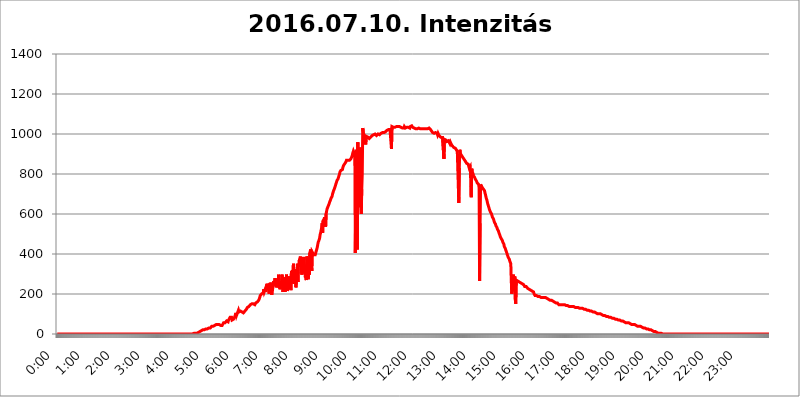
| Category | 2016.07.10. Intenzitás [W/m^2] |
|---|---|
| 0.0 | 0 |
| 0.0006944444444444445 | 0 |
| 0.001388888888888889 | 0 |
| 0.0020833333333333333 | 0 |
| 0.002777777777777778 | 0 |
| 0.003472222222222222 | 0 |
| 0.004166666666666667 | 0 |
| 0.004861111111111111 | 0 |
| 0.005555555555555556 | 0 |
| 0.0062499999999999995 | 0 |
| 0.006944444444444444 | 0 |
| 0.007638888888888889 | 0 |
| 0.008333333333333333 | 0 |
| 0.009027777777777779 | 0 |
| 0.009722222222222222 | 0 |
| 0.010416666666666666 | 0 |
| 0.011111111111111112 | 0 |
| 0.011805555555555555 | 0 |
| 0.012499999999999999 | 0 |
| 0.013194444444444444 | 0 |
| 0.013888888888888888 | 0 |
| 0.014583333333333332 | 0 |
| 0.015277777777777777 | 0 |
| 0.015972222222222224 | 0 |
| 0.016666666666666666 | 0 |
| 0.017361111111111112 | 0 |
| 0.018055555555555557 | 0 |
| 0.01875 | 0 |
| 0.019444444444444445 | 0 |
| 0.02013888888888889 | 0 |
| 0.020833333333333332 | 0 |
| 0.02152777777777778 | 0 |
| 0.022222222222222223 | 0 |
| 0.02291666666666667 | 0 |
| 0.02361111111111111 | 0 |
| 0.024305555555555556 | 0 |
| 0.024999999999999998 | 0 |
| 0.025694444444444447 | 0 |
| 0.02638888888888889 | 0 |
| 0.027083333333333334 | 0 |
| 0.027777777777777776 | 0 |
| 0.02847222222222222 | 0 |
| 0.029166666666666664 | 0 |
| 0.029861111111111113 | 0 |
| 0.030555555555555555 | 0 |
| 0.03125 | 0 |
| 0.03194444444444445 | 0 |
| 0.03263888888888889 | 0 |
| 0.03333333333333333 | 0 |
| 0.034027777777777775 | 0 |
| 0.034722222222222224 | 0 |
| 0.035416666666666666 | 0 |
| 0.036111111111111115 | 0 |
| 0.03680555555555556 | 0 |
| 0.0375 | 0 |
| 0.03819444444444444 | 0 |
| 0.03888888888888889 | 0 |
| 0.03958333333333333 | 0 |
| 0.04027777777777778 | 0 |
| 0.04097222222222222 | 0 |
| 0.041666666666666664 | 0 |
| 0.042361111111111106 | 0 |
| 0.04305555555555556 | 0 |
| 0.043750000000000004 | 0 |
| 0.044444444444444446 | 0 |
| 0.04513888888888889 | 0 |
| 0.04583333333333334 | 0 |
| 0.04652777777777778 | 0 |
| 0.04722222222222222 | 0 |
| 0.04791666666666666 | 0 |
| 0.04861111111111111 | 0 |
| 0.049305555555555554 | 0 |
| 0.049999999999999996 | 0 |
| 0.05069444444444445 | 0 |
| 0.051388888888888894 | 0 |
| 0.052083333333333336 | 0 |
| 0.05277777777777778 | 0 |
| 0.05347222222222222 | 0 |
| 0.05416666666666667 | 0 |
| 0.05486111111111111 | 0 |
| 0.05555555555555555 | 0 |
| 0.05625 | 0 |
| 0.05694444444444444 | 0 |
| 0.057638888888888885 | 0 |
| 0.05833333333333333 | 0 |
| 0.05902777777777778 | 0 |
| 0.059722222222222225 | 0 |
| 0.06041666666666667 | 0 |
| 0.061111111111111116 | 0 |
| 0.06180555555555556 | 0 |
| 0.0625 | 0 |
| 0.06319444444444444 | 0 |
| 0.06388888888888888 | 0 |
| 0.06458333333333334 | 0 |
| 0.06527777777777778 | 0 |
| 0.06597222222222222 | 0 |
| 0.06666666666666667 | 0 |
| 0.06736111111111111 | 0 |
| 0.06805555555555555 | 0 |
| 0.06874999999999999 | 0 |
| 0.06944444444444443 | 0 |
| 0.07013888888888889 | 0 |
| 0.07083333333333333 | 0 |
| 0.07152777777777779 | 0 |
| 0.07222222222222223 | 0 |
| 0.07291666666666667 | 0 |
| 0.07361111111111111 | 0 |
| 0.07430555555555556 | 0 |
| 0.075 | 0 |
| 0.07569444444444444 | 0 |
| 0.0763888888888889 | 0 |
| 0.07708333333333334 | 0 |
| 0.07777777777777778 | 0 |
| 0.07847222222222222 | 0 |
| 0.07916666666666666 | 0 |
| 0.0798611111111111 | 0 |
| 0.08055555555555556 | 0 |
| 0.08125 | 0 |
| 0.08194444444444444 | 0 |
| 0.08263888888888889 | 0 |
| 0.08333333333333333 | 0 |
| 0.08402777777777777 | 0 |
| 0.08472222222222221 | 0 |
| 0.08541666666666665 | 0 |
| 0.08611111111111112 | 0 |
| 0.08680555555555557 | 0 |
| 0.08750000000000001 | 0 |
| 0.08819444444444445 | 0 |
| 0.08888888888888889 | 0 |
| 0.08958333333333333 | 0 |
| 0.09027777777777778 | 0 |
| 0.09097222222222222 | 0 |
| 0.09166666666666667 | 0 |
| 0.09236111111111112 | 0 |
| 0.09305555555555556 | 0 |
| 0.09375 | 0 |
| 0.09444444444444444 | 0 |
| 0.09513888888888888 | 0 |
| 0.09583333333333333 | 0 |
| 0.09652777777777777 | 0 |
| 0.09722222222222222 | 0 |
| 0.09791666666666667 | 0 |
| 0.09861111111111111 | 0 |
| 0.09930555555555555 | 0 |
| 0.09999999999999999 | 0 |
| 0.10069444444444443 | 0 |
| 0.1013888888888889 | 0 |
| 0.10208333333333335 | 0 |
| 0.10277777777777779 | 0 |
| 0.10347222222222223 | 0 |
| 0.10416666666666667 | 0 |
| 0.10486111111111111 | 0 |
| 0.10555555555555556 | 0 |
| 0.10625 | 0 |
| 0.10694444444444444 | 0 |
| 0.1076388888888889 | 0 |
| 0.10833333333333334 | 0 |
| 0.10902777777777778 | 0 |
| 0.10972222222222222 | 0 |
| 0.1111111111111111 | 0 |
| 0.11180555555555556 | 0 |
| 0.11180555555555556 | 0 |
| 0.1125 | 0 |
| 0.11319444444444444 | 0 |
| 0.11388888888888889 | 0 |
| 0.11458333333333333 | 0 |
| 0.11527777777777777 | 0 |
| 0.11597222222222221 | 0 |
| 0.11666666666666665 | 0 |
| 0.1173611111111111 | 0 |
| 0.11805555555555557 | 0 |
| 0.11944444444444445 | 0 |
| 0.12013888888888889 | 0 |
| 0.12083333333333333 | 0 |
| 0.12152777777777778 | 0 |
| 0.12222222222222223 | 0 |
| 0.12291666666666667 | 0 |
| 0.12291666666666667 | 0 |
| 0.12361111111111112 | 0 |
| 0.12430555555555556 | 0 |
| 0.125 | 0 |
| 0.12569444444444444 | 0 |
| 0.12638888888888888 | 0 |
| 0.12708333333333333 | 0 |
| 0.16875 | 0 |
| 0.12847222222222224 | 0 |
| 0.12916666666666668 | 0 |
| 0.12986111111111112 | 0 |
| 0.13055555555555556 | 0 |
| 0.13125 | 0 |
| 0.13194444444444445 | 0 |
| 0.1326388888888889 | 0 |
| 0.13333333333333333 | 0 |
| 0.13402777777777777 | 0 |
| 0.13402777777777777 | 0 |
| 0.13472222222222222 | 0 |
| 0.13541666666666666 | 0 |
| 0.1361111111111111 | 0 |
| 0.13749999999999998 | 0 |
| 0.13819444444444443 | 0 |
| 0.1388888888888889 | 0 |
| 0.13958333333333334 | 0 |
| 0.14027777777777778 | 0 |
| 0.14097222222222222 | 0 |
| 0.14166666666666666 | 0 |
| 0.1423611111111111 | 0 |
| 0.14305555555555557 | 0 |
| 0.14375000000000002 | 0 |
| 0.14444444444444446 | 0 |
| 0.1451388888888889 | 0 |
| 0.1451388888888889 | 0 |
| 0.14652777777777778 | 0 |
| 0.14722222222222223 | 0 |
| 0.14791666666666667 | 0 |
| 0.1486111111111111 | 0 |
| 0.14930555555555555 | 0 |
| 0.15 | 0 |
| 0.15069444444444444 | 0 |
| 0.15138888888888888 | 0 |
| 0.15208333333333332 | 0 |
| 0.15277777777777776 | 0 |
| 0.15347222222222223 | 0 |
| 0.15416666666666667 | 0 |
| 0.15486111111111112 | 0 |
| 0.15555555555555556 | 0 |
| 0.15625 | 0 |
| 0.15694444444444444 | 0 |
| 0.15763888888888888 | 0 |
| 0.15833333333333333 | 0 |
| 0.15902777777777777 | 0 |
| 0.15972222222222224 | 0 |
| 0.16041666666666668 | 0 |
| 0.16111111111111112 | 0 |
| 0.16180555555555556 | 0 |
| 0.1625 | 0 |
| 0.16319444444444445 | 0 |
| 0.1638888888888889 | 0 |
| 0.16458333333333333 | 0 |
| 0.16527777777777777 | 0 |
| 0.16597222222222222 | 0 |
| 0.16666666666666666 | 0 |
| 0.1673611111111111 | 0 |
| 0.16805555555555554 | 0 |
| 0.16874999999999998 | 0 |
| 0.16944444444444443 | 0 |
| 0.17013888888888887 | 0 |
| 0.1708333333333333 | 0 |
| 0.17152777777777775 | 0 |
| 0.17222222222222225 | 0 |
| 0.1729166666666667 | 0 |
| 0.17361111111111113 | 0 |
| 0.17430555555555557 | 0 |
| 0.17500000000000002 | 0 |
| 0.17569444444444446 | 0 |
| 0.1763888888888889 | 0 |
| 0.17708333333333334 | 0 |
| 0.17777777777777778 | 0 |
| 0.17847222222222223 | 0 |
| 0.17916666666666667 | 0 |
| 0.1798611111111111 | 0 |
| 0.18055555555555555 | 0 |
| 0.18125 | 0 |
| 0.18194444444444444 | 0 |
| 0.1826388888888889 | 0 |
| 0.18333333333333335 | 0 |
| 0.1840277777777778 | 0 |
| 0.18472222222222223 | 0 |
| 0.18541666666666667 | 0 |
| 0.18611111111111112 | 0 |
| 0.18680555555555556 | 0 |
| 0.1875 | 0 |
| 0.18819444444444444 | 0 |
| 0.18888888888888888 | 0 |
| 0.18958333333333333 | 0 |
| 0.19027777777777777 | 0 |
| 0.1909722222222222 | 0 |
| 0.19166666666666665 | 3.525 |
| 0.19236111111111112 | 3.525 |
| 0.19305555555555554 | 3.525 |
| 0.19375 | 3.525 |
| 0.19444444444444445 | 3.525 |
| 0.1951388888888889 | 3.525 |
| 0.19583333333333333 | 3.525 |
| 0.19652777777777777 | 7.887 |
| 0.19722222222222222 | 7.887 |
| 0.19791666666666666 | 7.887 |
| 0.1986111111111111 | 12.257 |
| 0.19930555555555554 | 12.257 |
| 0.19999999999999998 | 12.257 |
| 0.20069444444444443 | 12.257 |
| 0.20138888888888887 | 12.257 |
| 0.2020833333333333 | 16.636 |
| 0.2027777777777778 | 16.636 |
| 0.2034722222222222 | 16.636 |
| 0.2041666666666667 | 21.024 |
| 0.20486111111111113 | 21.024 |
| 0.20555555555555557 | 21.024 |
| 0.20625000000000002 | 21.024 |
| 0.20694444444444446 | 25.419 |
| 0.2076388888888889 | 25.419 |
| 0.20833333333333334 | 25.419 |
| 0.20902777777777778 | 25.419 |
| 0.20972222222222223 | 25.419 |
| 0.21041666666666667 | 25.419 |
| 0.2111111111111111 | 25.419 |
| 0.21180555555555555 | 29.823 |
| 0.2125 | 29.823 |
| 0.21319444444444444 | 29.823 |
| 0.2138888888888889 | 29.823 |
| 0.21458333333333335 | 29.823 |
| 0.2152777777777778 | 34.234 |
| 0.21597222222222223 | 34.234 |
| 0.21666666666666667 | 38.653 |
| 0.21736111111111112 | 38.653 |
| 0.21805555555555556 | 38.653 |
| 0.21875 | 38.653 |
| 0.21944444444444444 | 43.079 |
| 0.22013888888888888 | 38.653 |
| 0.22083333333333333 | 43.079 |
| 0.22152777777777777 | 43.079 |
| 0.2222222222222222 | 47.511 |
| 0.22291666666666665 | 47.511 |
| 0.2236111111111111 | 47.511 |
| 0.22430555555555556 | 43.079 |
| 0.225 | 47.511 |
| 0.22569444444444445 | 47.511 |
| 0.2263888888888889 | 47.511 |
| 0.22708333333333333 | 47.511 |
| 0.22777777777777777 | 43.079 |
| 0.22847222222222222 | 43.079 |
| 0.22916666666666666 | 43.079 |
| 0.2298611111111111 | 43.079 |
| 0.23055555555555554 | 43.079 |
| 0.23124999999999998 | 43.079 |
| 0.23194444444444443 | 47.511 |
| 0.23263888888888887 | 47.511 |
| 0.2333333333333333 | 56.398 |
| 0.2340277777777778 | 51.951 |
| 0.2347222222222222 | 56.398 |
| 0.2354166666666667 | 56.398 |
| 0.23611111111111113 | 60.85 |
| 0.23680555555555557 | 56.398 |
| 0.23750000000000002 | 65.31 |
| 0.23819444444444446 | 60.85 |
| 0.2388888888888889 | 69.775 |
| 0.23958333333333334 | 60.85 |
| 0.24027777777777778 | 69.775 |
| 0.24097222222222223 | 65.31 |
| 0.24166666666666667 | 69.775 |
| 0.2423611111111111 | 83.205 |
| 0.24305555555555555 | 78.722 |
| 0.24375 | 78.722 |
| 0.24444444444444446 | 83.205 |
| 0.24513888888888888 | 69.775 |
| 0.24583333333333335 | 69.775 |
| 0.2465277777777778 | 69.775 |
| 0.24722222222222223 | 74.246 |
| 0.24791666666666667 | 78.722 |
| 0.24861111111111112 | 83.205 |
| 0.24930555555555556 | 83.205 |
| 0.25 | 87.692 |
| 0.25069444444444444 | 105.69 |
| 0.2513888888888889 | 92.184 |
| 0.2520833333333333 | 92.184 |
| 0.25277777777777777 | 105.69 |
| 0.2534722222222222 | 101.184 |
| 0.25416666666666665 | 119.235 |
| 0.2548611111111111 | 110.201 |
| 0.2555555555555556 | 110.201 |
| 0.25625000000000003 | 114.716 |
| 0.2569444444444445 | 114.716 |
| 0.2576388888888889 | 114.716 |
| 0.25833333333333336 | 110.201 |
| 0.2590277777777778 | 110.201 |
| 0.25972222222222224 | 105.69 |
| 0.2604166666666667 | 105.69 |
| 0.2611111111111111 | 105.69 |
| 0.26180555555555557 | 110.201 |
| 0.2625 | 110.201 |
| 0.26319444444444445 | 114.716 |
| 0.2638888888888889 | 119.235 |
| 0.26458333333333334 | 119.235 |
| 0.2652777777777778 | 123.758 |
| 0.2659722222222222 | 128.284 |
| 0.26666666666666666 | 132.814 |
| 0.2673611111111111 | 132.814 |
| 0.26805555555555555 | 132.814 |
| 0.26875 | 137.347 |
| 0.26944444444444443 | 137.347 |
| 0.2701388888888889 | 141.884 |
| 0.2708333333333333 | 146.423 |
| 0.27152777777777776 | 150.964 |
| 0.2722222222222222 | 146.423 |
| 0.27291666666666664 | 150.964 |
| 0.2736111111111111 | 150.964 |
| 0.2743055555555555 | 150.964 |
| 0.27499999999999997 | 150.964 |
| 0.27569444444444446 | 150.964 |
| 0.27638888888888885 | 150.964 |
| 0.27708333333333335 | 146.423 |
| 0.2777777777777778 | 150.964 |
| 0.27847222222222223 | 155.509 |
| 0.2791666666666667 | 155.509 |
| 0.2798611111111111 | 160.056 |
| 0.28055555555555556 | 160.056 |
| 0.28125 | 160.056 |
| 0.28194444444444444 | 164.605 |
| 0.2826388888888889 | 169.156 |
| 0.2833333333333333 | 173.709 |
| 0.28402777777777777 | 182.82 |
| 0.2847222222222222 | 191.937 |
| 0.28541666666666665 | 191.937 |
| 0.28611111111111115 | 196.497 |
| 0.28680555555555554 | 201.058 |
| 0.28750000000000003 | 205.62 |
| 0.2881944444444445 | 205.62 |
| 0.2888888888888889 | 205.62 |
| 0.28958333333333336 | 223.873 |
| 0.2902777777777778 | 210.182 |
| 0.29097222222222224 | 214.746 |
| 0.2916666666666667 | 223.873 |
| 0.2923611111111111 | 210.182 |
| 0.29305555555555557 | 214.746 |
| 0.29375 | 210.182 |
| 0.29444444444444445 | 251.251 |
| 0.2951388888888889 | 246.689 |
| 0.29583333333333334 | 233 |
| 0.2965277777777778 | 219.309 |
| 0.2972222222222222 | 201.058 |
| 0.29791666666666666 | 201.058 |
| 0.2986111111111111 | 255.813 |
| 0.29930555555555555 | 201.058 |
| 0.3 | 255.813 |
| 0.30069444444444443 | 196.497 |
| 0.3013888888888889 | 205.62 |
| 0.3020833333333333 | 223.873 |
| 0.30277777777777776 | 228.436 |
| 0.3034722222222222 | 264.932 |
| 0.30416666666666664 | 242.127 |
| 0.3048611111111111 | 242.127 |
| 0.3055555555555555 | 278.603 |
| 0.30624999999999997 | 264.932 |
| 0.3069444444444444 | 233 |
| 0.3076388888888889 | 242.127 |
| 0.30833333333333335 | 242.127 |
| 0.3090277777777778 | 246.689 |
| 0.30972222222222223 | 251.251 |
| 0.3104166666666667 | 296.808 |
| 0.3111111111111111 | 233 |
| 0.31180555555555556 | 246.689 |
| 0.3125 | 223.873 |
| 0.31319444444444444 | 228.436 |
| 0.3138888888888889 | 264.932 |
| 0.3145833333333333 | 237.564 |
| 0.31527777777777777 | 296.808 |
| 0.3159722222222222 | 292.259 |
| 0.31666666666666665 | 210.182 |
| 0.31736111111111115 | 214.746 |
| 0.31805555555555554 | 283.156 |
| 0.31875000000000003 | 287.709 |
| 0.3194444444444445 | 210.182 |
| 0.3201388888888889 | 278.603 |
| 0.32083333333333336 | 251.251 |
| 0.3215277777777778 | 296.808 |
| 0.32222222222222224 | 264.932 |
| 0.3229166666666667 | 214.746 |
| 0.3236111111111111 | 210.182 |
| 0.32430555555555557 | 287.709 |
| 0.325 | 260.373 |
| 0.32569444444444445 | 233 |
| 0.3263888888888889 | 283.156 |
| 0.32708333333333334 | 228.436 |
| 0.3277777777777778 | 219.309 |
| 0.3284722222222222 | 314.98 |
| 0.32916666666666666 | 305.898 |
| 0.3298611111111111 | 319.517 |
| 0.33055555555555555 | 269.49 |
| 0.33125 | 351.198 |
| 0.33194444444444443 | 251.251 |
| 0.3326388888888889 | 324.052 |
| 0.3333333333333333 | 278.603 |
| 0.3340277777777778 | 269.49 |
| 0.3347222222222222 | 233 |
| 0.3354166666666667 | 264.932 |
| 0.3361111111111111 | 319.517 |
| 0.3368055555555556 | 351.198 |
| 0.33749999999999997 | 260.373 |
| 0.33819444444444446 | 346.682 |
| 0.33888888888888885 | 337.639 |
| 0.33958333333333335 | 369.23 |
| 0.34027777777777773 | 378.224 |
| 0.34097222222222223 | 387.202 |
| 0.3416666666666666 | 355.712 |
| 0.3423611111111111 | 319.517 |
| 0.3430555555555555 | 296.808 |
| 0.34375 | 378.224 |
| 0.3444444444444445 | 382.715 |
| 0.3451388888888889 | 378.224 |
| 0.3458333333333334 | 378.224 |
| 0.34652777777777777 | 378.224 |
| 0.34722222222222227 | 378.224 |
| 0.34791666666666665 | 283.156 |
| 0.34861111111111115 | 296.808 |
| 0.34930555555555554 | 269.49 |
| 0.35000000000000003 | 387.202 |
| 0.3506944444444444 | 387.202 |
| 0.3513888888888889 | 369.23 |
| 0.3520833333333333 | 274.047 |
| 0.3527777777777778 | 324.052 |
| 0.3534722222222222 | 296.808 |
| 0.3541666666666667 | 405.108 |
| 0.3548611111111111 | 414.035 |
| 0.35555555555555557 | 422.943 |
| 0.35625 | 422.943 |
| 0.35694444444444445 | 314.98 |
| 0.3576388888888889 | 409.574 |
| 0.35833333333333334 | 409.574 |
| 0.3590277777777778 | 405.108 |
| 0.3597222222222222 | 396.164 |
| 0.36041666666666666 | 396.164 |
| 0.3611111111111111 | 391.685 |
| 0.36180555555555555 | 396.164 |
| 0.3625 | 405.108 |
| 0.36319444444444443 | 414.035 |
| 0.3638888888888889 | 422.943 |
| 0.3645833333333333 | 431.833 |
| 0.3652777777777778 | 445.129 |
| 0.3659722222222222 | 458.38 |
| 0.3666666666666667 | 462.786 |
| 0.3673611111111111 | 471.582 |
| 0.3680555555555556 | 480.356 |
| 0.36874999999999997 | 497.836 |
| 0.36944444444444446 | 506.542 |
| 0.37013888888888885 | 519.555 |
| 0.37083333333333335 | 532.513 |
| 0.37152777777777773 | 553.986 |
| 0.37222222222222223 | 506.542 |
| 0.3729166666666666 | 566.793 |
| 0.3736111111111111 | 566.793 |
| 0.3743055555555555 | 575.299 |
| 0.375 | 583.779 |
| 0.3756944444444445 | 588.009 |
| 0.3763888888888889 | 536.82 |
| 0.3770833333333334 | 600.661 |
| 0.37777777777777777 | 613.252 |
| 0.37847222222222227 | 625.784 |
| 0.37916666666666665 | 629.948 |
| 0.37986111111111115 | 638.256 |
| 0.38055555555555554 | 642.4 |
| 0.38125000000000003 | 650.667 |
| 0.3819444444444444 | 658.909 |
| 0.3826388888888889 | 663.019 |
| 0.3833333333333333 | 671.22 |
| 0.3840277777777778 | 679.395 |
| 0.3847222222222222 | 683.473 |
| 0.3854166666666667 | 687.544 |
| 0.3861111111111111 | 699.717 |
| 0.38680555555555557 | 703.762 |
| 0.3875 | 715.858 |
| 0.38819444444444445 | 719.877 |
| 0.3888888888888889 | 727.896 |
| 0.38958333333333334 | 735.89 |
| 0.3902777777777778 | 743.859 |
| 0.3909722222222222 | 751.803 |
| 0.39166666666666666 | 755.766 |
| 0.3923611111111111 | 767.62 |
| 0.39305555555555555 | 771.559 |
| 0.39375 | 775.492 |
| 0.39444444444444443 | 783.342 |
| 0.3951388888888889 | 791.169 |
| 0.3958333333333333 | 798.974 |
| 0.3965277777777778 | 810.641 |
| 0.3972222222222222 | 814.519 |
| 0.3979166666666667 | 818.392 |
| 0.3986111111111111 | 822.26 |
| 0.3993055555555556 | 822.26 |
| 0.39999999999999997 | 822.26 |
| 0.40069444444444446 | 833.834 |
| 0.40138888888888885 | 841.526 |
| 0.40208333333333335 | 845.365 |
| 0.40277777777777773 | 849.199 |
| 0.40347222222222223 | 853.029 |
| 0.4041666666666666 | 845.365 |
| 0.4048611111111111 | 860.676 |
| 0.4055555555555555 | 868.305 |
| 0.40625 | 864.493 |
| 0.4069444444444445 | 868.305 |
| 0.4076388888888889 | 868.305 |
| 0.4083333333333334 | 868.305 |
| 0.40902777777777777 | 868.305 |
| 0.40972222222222227 | 868.305 |
| 0.41041666666666665 | 872.114 |
| 0.41111111111111115 | 872.114 |
| 0.41180555555555554 | 875.918 |
| 0.41250000000000003 | 879.719 |
| 0.4131944444444444 | 887.309 |
| 0.4138888888888889 | 894.885 |
| 0.4145833333333333 | 906.223 |
| 0.4152777777777778 | 913.766 |
| 0.4159722222222222 | 909.996 |
| 0.4166666666666667 | 913.766 |
| 0.4173611111111111 | 891.099 |
| 0.41805555555555557 | 405.108 |
| 0.41875 | 719.877 |
| 0.41944444444444445 | 921.298 |
| 0.4201388888888889 | 779.42 |
| 0.42083333333333334 | 422.943 |
| 0.4215277777777778 | 958.814 |
| 0.4222222222222222 | 719.877 |
| 0.42291666666666666 | 634.105 |
| 0.4236111111111111 | 739.877 |
| 0.42430555555555555 | 921.298 |
| 0.425 | 932.576 |
| 0.42569444444444443 | 642.4 |
| 0.4263888888888889 | 600.661 |
| 0.4270833333333333 | 723.889 |
| 0.4277777777777778 | 798.974 |
| 0.4284722222222222 | 1029.798 |
| 0.4291666666666667 | 1011.118 |
| 0.4298611111111111 | 999.916 |
| 0.4305555555555556 | 988.714 |
| 0.43124999999999997 | 988.714 |
| 0.43194444444444446 | 988.714 |
| 0.43263888888888885 | 947.58 |
| 0.43333333333333335 | 988.714 |
| 0.43402777777777773 | 988.714 |
| 0.43472222222222223 | 992.448 |
| 0.4354166666666666 | 984.98 |
| 0.4361111111111111 | 984.98 |
| 0.4368055555555555 | 981.244 |
| 0.4375 | 977.508 |
| 0.4381944444444445 | 977.508 |
| 0.4388888888888889 | 973.772 |
| 0.4395833333333334 | 984.98 |
| 0.44027777777777777 | 988.714 |
| 0.44097222222222227 | 988.714 |
| 0.44166666666666665 | 992.448 |
| 0.44236111111111115 | 992.448 |
| 0.44305555555555554 | 992.448 |
| 0.44375000000000003 | 996.182 |
| 0.4444444444444444 | 996.182 |
| 0.4451388888888889 | 999.916 |
| 0.4458333333333333 | 999.916 |
| 0.4465277777777778 | 999.916 |
| 0.4472222222222222 | 999.916 |
| 0.4479166666666667 | 992.448 |
| 0.4486111111111111 | 996.182 |
| 0.44930555555555557 | 996.182 |
| 0.45 | 999.916 |
| 0.45069444444444445 | 999.916 |
| 0.4513888888888889 | 996.182 |
| 0.45208333333333334 | 996.182 |
| 0.4527777777777778 | 999.916 |
| 0.4534722222222222 | 999.916 |
| 0.45416666666666666 | 1003.65 |
| 0.4548611111111111 | 1003.65 |
| 0.45555555555555555 | 1003.65 |
| 0.45625 | 1007.383 |
| 0.45694444444444443 | 1007.383 |
| 0.4576388888888889 | 1003.65 |
| 0.4583333333333333 | 1007.383 |
| 0.4590277777777778 | 1007.383 |
| 0.4597222222222222 | 1011.118 |
| 0.4604166666666667 | 1011.118 |
| 0.4611111111111111 | 1014.852 |
| 0.4618055555555556 | 1014.852 |
| 0.46249999999999997 | 1018.587 |
| 0.46319444444444446 | 1022.323 |
| 0.46388888888888885 | 1022.323 |
| 0.46458333333333335 | 1022.323 |
| 0.46527777777777773 | 1022.323 |
| 0.46597222222222223 | 1022.323 |
| 0.4666666666666666 | 1022.323 |
| 0.4673611111111111 | 1022.323 |
| 0.4680555555555555 | 1022.323 |
| 0.46875 | 925.06 |
| 0.4694444444444445 | 1037.277 |
| 0.4701388888888889 | 1033.537 |
| 0.4708333333333334 | 1033.537 |
| 0.47152777777777777 | 1033.537 |
| 0.47222222222222227 | 1033.537 |
| 0.47291666666666665 | 1029.798 |
| 0.47361111111111115 | 1033.537 |
| 0.47430555555555554 | 1033.537 |
| 0.47500000000000003 | 1033.537 |
| 0.4756944444444444 | 1037.277 |
| 0.4763888888888889 | 1037.277 |
| 0.4770833333333333 | 1037.277 |
| 0.4777777777777778 | 1037.277 |
| 0.4784722222222222 | 1037.277 |
| 0.4791666666666667 | 1037.277 |
| 0.4798611111111111 | 1037.277 |
| 0.48055555555555557 | 1033.537 |
| 0.48125 | 1037.277 |
| 0.48194444444444445 | 1033.537 |
| 0.4826388888888889 | 1037.277 |
| 0.48333333333333334 | 1029.798 |
| 0.4840277777777778 | 1029.798 |
| 0.4847222222222222 | 1029.798 |
| 0.48541666666666666 | 1029.798 |
| 0.4861111111111111 | 1029.798 |
| 0.48680555555555555 | 1037.277 |
| 0.4875 | 1033.537 |
| 0.48819444444444443 | 1029.798 |
| 0.4888888888888889 | 1033.537 |
| 0.4895833333333333 | 1033.537 |
| 0.4902777777777778 | 1033.537 |
| 0.4909722222222222 | 1037.277 |
| 0.4916666666666667 | 1037.277 |
| 0.4923611111111111 | 1033.537 |
| 0.4930555555555556 | 1033.537 |
| 0.49374999999999997 | 1033.537 |
| 0.49444444444444446 | 1029.798 |
| 0.49513888888888885 | 1037.277 |
| 0.49583333333333335 | 1037.277 |
| 0.49652777777777773 | 1037.277 |
| 0.49722222222222223 | 1041.019 |
| 0.4979166666666666 | 1037.277 |
| 0.4986111111111111 | 1033.537 |
| 0.4993055555555555 | 1033.537 |
| 0.5 | 1033.537 |
| 0.5006944444444444 | 1029.798 |
| 0.5013888888888889 | 1029.798 |
| 0.5020833333333333 | 1029.798 |
| 0.5027777777777778 | 1026.06 |
| 0.5034722222222222 | 1026.06 |
| 0.5041666666666667 | 1026.06 |
| 0.5048611111111111 | 1026.06 |
| 0.5055555555555555 | 1029.798 |
| 0.50625 | 1029.798 |
| 0.5069444444444444 | 1029.798 |
| 0.5076388888888889 | 1026.06 |
| 0.5083333333333333 | 1026.06 |
| 0.5090277777777777 | 1026.06 |
| 0.5097222222222222 | 1026.06 |
| 0.5104166666666666 | 1026.06 |
| 0.5111111111111112 | 1026.06 |
| 0.5118055555555555 | 1026.06 |
| 0.5125000000000001 | 1026.06 |
| 0.5131944444444444 | 1026.06 |
| 0.513888888888889 | 1026.06 |
| 0.5145833333333333 | 1026.06 |
| 0.5152777777777778 | 1026.06 |
| 0.5159722222222222 | 1026.06 |
| 0.5166666666666667 | 1026.06 |
| 0.517361111111111 | 1026.06 |
| 0.5180555555555556 | 1022.323 |
| 0.5187499999999999 | 1022.323 |
| 0.5194444444444445 | 1026.06 |
| 0.5201388888888888 | 1026.06 |
| 0.5208333333333334 | 1026.06 |
| 0.5215277777777778 | 1029.798 |
| 0.5222222222222223 | 1026.06 |
| 0.5229166666666667 | 1026.06 |
| 0.5236111111111111 | 1022.323 |
| 0.5243055555555556 | 1018.587 |
| 0.525 | 1014.852 |
| 0.5256944444444445 | 1011.118 |
| 0.5263888888888889 | 1007.383 |
| 0.5270833333333333 | 1007.383 |
| 0.5277777777777778 | 1003.65 |
| 0.5284722222222222 | 1003.65 |
| 0.5291666666666667 | 1003.65 |
| 0.5298611111111111 | 1007.383 |
| 0.5305555555555556 | 1007.383 |
| 0.53125 | 1003.65 |
| 0.5319444444444444 | 1003.65 |
| 0.5326388888888889 | 1003.65 |
| 0.5333333333333333 | 996.182 |
| 0.5340277777777778 | 1003.65 |
| 0.5347222222222222 | 999.916 |
| 0.5354166666666667 | 992.448 |
| 0.5361111111111111 | 992.448 |
| 0.5368055555555555 | 988.714 |
| 0.5375 | 984.98 |
| 0.5381944444444444 | 984.98 |
| 0.5388888888888889 | 981.244 |
| 0.5395833333333333 | 981.244 |
| 0.5402777777777777 | 988.714 |
| 0.5409722222222222 | 988.714 |
| 0.5416666666666666 | 988.714 |
| 0.5423611111111112 | 875.918 |
| 0.5430555555555555 | 973.772 |
| 0.5437500000000001 | 977.508 |
| 0.5444444444444444 | 973.772 |
| 0.545138888888889 | 970.034 |
| 0.5458333333333333 | 966.295 |
| 0.5465277777777778 | 962.555 |
| 0.5472222222222222 | 962.555 |
| 0.5479166666666667 | 962.555 |
| 0.548611111111111 | 966.295 |
| 0.5493055555555556 | 970.034 |
| 0.5499999999999999 | 962.555 |
| 0.5506944444444445 | 951.327 |
| 0.5513888888888888 | 958.814 |
| 0.5520833333333334 | 955.071 |
| 0.5527777777777778 | 947.58 |
| 0.5534722222222223 | 947.58 |
| 0.5541666666666667 | 940.082 |
| 0.5548611111111111 | 940.082 |
| 0.5555555555555556 | 936.33 |
| 0.55625 | 932.576 |
| 0.5569444444444445 | 932.576 |
| 0.5576388888888889 | 932.576 |
| 0.5583333333333333 | 928.819 |
| 0.5590277777777778 | 925.06 |
| 0.5597222222222222 | 925.06 |
| 0.5604166666666667 | 917.534 |
| 0.5611111111111111 | 909.996 |
| 0.5618055555555556 | 909.996 |
| 0.5625 | 906.223 |
| 0.5631944444444444 | 654.791 |
| 0.5638888888888889 | 829.981 |
| 0.5645833333333333 | 921.298 |
| 0.5652777777777778 | 906.223 |
| 0.5659722222222222 | 898.668 |
| 0.5666666666666667 | 894.885 |
| 0.5673611111111111 | 891.099 |
| 0.5680555555555555 | 891.099 |
| 0.56875 | 883.516 |
| 0.5694444444444444 | 883.516 |
| 0.5701388888888889 | 875.918 |
| 0.5708333333333333 | 875.918 |
| 0.5715277777777777 | 868.305 |
| 0.5722222222222222 | 864.493 |
| 0.5729166666666666 | 860.676 |
| 0.5736111111111112 | 856.855 |
| 0.5743055555555555 | 853.029 |
| 0.5750000000000001 | 849.199 |
| 0.5756944444444444 | 849.199 |
| 0.576388888888889 | 849.199 |
| 0.5770833333333333 | 845.365 |
| 0.5777777777777778 | 829.981 |
| 0.5784722222222222 | 833.834 |
| 0.5791666666666667 | 837.682 |
| 0.579861111111111 | 771.559 |
| 0.5805555555555556 | 683.473 |
| 0.5812499999999999 | 826.123 |
| 0.5819444444444445 | 814.519 |
| 0.5826388888888888 | 806.757 |
| 0.5833333333333334 | 798.974 |
| 0.5840277777777778 | 791.169 |
| 0.5847222222222223 | 787.258 |
| 0.5854166666666667 | 783.342 |
| 0.5861111111111111 | 775.492 |
| 0.5868055555555556 | 775.492 |
| 0.5875 | 771.559 |
| 0.5881944444444445 | 763.674 |
| 0.5888888888888889 | 755.766 |
| 0.5895833333333333 | 759.723 |
| 0.5902777777777778 | 759.723 |
| 0.5909722222222222 | 747.834 |
| 0.5916666666666667 | 731.896 |
| 0.5923611111111111 | 264.932 |
| 0.5930555555555556 | 553.986 |
| 0.59375 | 747.834 |
| 0.5944444444444444 | 743.859 |
| 0.5951388888888889 | 743.859 |
| 0.5958333333333333 | 731.896 |
| 0.5965277777777778 | 731.896 |
| 0.5972222222222222 | 731.896 |
| 0.5979166666666667 | 723.889 |
| 0.5986111111111111 | 719.877 |
| 0.5993055555555555 | 715.858 |
| 0.6 | 703.762 |
| 0.6006944444444444 | 695.666 |
| 0.6013888888888889 | 683.473 |
| 0.6020833333333333 | 675.311 |
| 0.6027777777777777 | 667.123 |
| 0.6034722222222222 | 654.791 |
| 0.6041666666666666 | 646.537 |
| 0.6048611111111112 | 638.256 |
| 0.6055555555555555 | 629.948 |
| 0.6062500000000001 | 621.613 |
| 0.6069444444444444 | 617.436 |
| 0.607638888888889 | 609.062 |
| 0.6083333333333333 | 604.864 |
| 0.6090277777777778 | 600.661 |
| 0.6097222222222222 | 592.233 |
| 0.6104166666666667 | 583.779 |
| 0.611111111111111 | 583.779 |
| 0.6118055555555556 | 575.299 |
| 0.6124999999999999 | 566.793 |
| 0.6131944444444445 | 558.261 |
| 0.6138888888888888 | 553.986 |
| 0.6145833333333334 | 549.704 |
| 0.6152777777777778 | 541.121 |
| 0.6159722222222223 | 536.82 |
| 0.6166666666666667 | 532.513 |
| 0.6173611111111111 | 523.88 |
| 0.6180555555555556 | 519.555 |
| 0.61875 | 515.223 |
| 0.6194444444444445 | 506.542 |
| 0.6201388888888889 | 502.192 |
| 0.6208333333333333 | 493.475 |
| 0.6215277777777778 | 484.735 |
| 0.6222222222222222 | 480.356 |
| 0.6229166666666667 | 475.972 |
| 0.6236111111111111 | 471.582 |
| 0.6243055555555556 | 467.187 |
| 0.625 | 458.38 |
| 0.6256944444444444 | 453.968 |
| 0.6263888888888889 | 449.551 |
| 0.6270833333333333 | 436.27 |
| 0.6277777777777778 | 431.833 |
| 0.6284722222222222 | 427.39 |
| 0.6291666666666667 | 418.492 |
| 0.6298611111111111 | 414.035 |
| 0.6305555555555555 | 405.108 |
| 0.63125 | 396.164 |
| 0.6319444444444444 | 391.685 |
| 0.6326388888888889 | 382.715 |
| 0.6333333333333333 | 378.224 |
| 0.6340277777777777 | 373.729 |
| 0.6347222222222222 | 364.728 |
| 0.6354166666666666 | 360.221 |
| 0.6361111111111112 | 351.198 |
| 0.6368055555555555 | 264.932 |
| 0.6375000000000001 | 201.058 |
| 0.6381944444444444 | 251.251 |
| 0.638888888888889 | 214.746 |
| 0.6395833333333333 | 296.808 |
| 0.6402777777777778 | 264.932 |
| 0.6409722222222222 | 242.127 |
| 0.6416666666666667 | 287.709 |
| 0.642361111111111 | 173.709 |
| 0.6430555555555556 | 150.964 |
| 0.6437499999999999 | 269.49 |
| 0.6444444444444445 | 264.932 |
| 0.6451388888888888 | 264.932 |
| 0.6458333333333334 | 264.932 |
| 0.6465277777777778 | 260.373 |
| 0.6472222222222223 | 260.373 |
| 0.6479166666666667 | 260.373 |
| 0.6486111111111111 | 260.373 |
| 0.6493055555555556 | 255.813 |
| 0.65 | 255.813 |
| 0.6506944444444445 | 251.251 |
| 0.6513888888888889 | 251.251 |
| 0.6520833333333333 | 251.251 |
| 0.6527777777777778 | 246.689 |
| 0.6534722222222222 | 246.689 |
| 0.6541666666666667 | 246.689 |
| 0.6548611111111111 | 242.127 |
| 0.6555555555555556 | 237.564 |
| 0.65625 | 242.127 |
| 0.6569444444444444 | 242.127 |
| 0.6576388888888889 | 237.564 |
| 0.6583333333333333 | 233 |
| 0.6590277777777778 | 233 |
| 0.6597222222222222 | 228.436 |
| 0.6604166666666667 | 228.436 |
| 0.6611111111111111 | 228.436 |
| 0.6618055555555555 | 223.873 |
| 0.6625 | 219.309 |
| 0.6631944444444444 | 219.309 |
| 0.6638888888888889 | 219.309 |
| 0.6645833333333333 | 219.309 |
| 0.6652777777777777 | 214.746 |
| 0.6659722222222222 | 214.746 |
| 0.6666666666666666 | 214.746 |
| 0.6673611111111111 | 214.746 |
| 0.6680555555555556 | 210.182 |
| 0.6687500000000001 | 201.058 |
| 0.6694444444444444 | 196.497 |
| 0.6701388888888888 | 191.937 |
| 0.6708333333333334 | 191.937 |
| 0.6715277777777778 | 191.937 |
| 0.6722222222222222 | 191.937 |
| 0.6729166666666666 | 187.378 |
| 0.6736111111111112 | 187.378 |
| 0.6743055555555556 | 187.378 |
| 0.6749999999999999 | 187.378 |
| 0.6756944444444444 | 187.378 |
| 0.6763888888888889 | 187.378 |
| 0.6770833333333334 | 187.378 |
| 0.6777777777777777 | 182.82 |
| 0.6784722222222223 | 182.82 |
| 0.6791666666666667 | 182.82 |
| 0.6798611111111111 | 182.82 |
| 0.6805555555555555 | 182.82 |
| 0.68125 | 182.82 |
| 0.6819444444444445 | 182.82 |
| 0.6826388888888889 | 182.82 |
| 0.6833333333333332 | 182.82 |
| 0.6840277777777778 | 182.82 |
| 0.6847222222222222 | 182.82 |
| 0.6854166666666667 | 178.264 |
| 0.686111111111111 | 178.264 |
| 0.6868055555555556 | 178.264 |
| 0.6875 | 178.264 |
| 0.6881944444444444 | 178.264 |
| 0.688888888888889 | 173.709 |
| 0.6895833333333333 | 173.709 |
| 0.6902777777777778 | 173.709 |
| 0.6909722222222222 | 169.156 |
| 0.6916666666666668 | 169.156 |
| 0.6923611111111111 | 169.156 |
| 0.6930555555555555 | 169.156 |
| 0.69375 | 164.605 |
| 0.6944444444444445 | 164.605 |
| 0.6951388888888889 | 164.605 |
| 0.6958333333333333 | 164.605 |
| 0.6965277777777777 | 164.605 |
| 0.6972222222222223 | 160.056 |
| 0.6979166666666666 | 160.056 |
| 0.6986111111111111 | 160.056 |
| 0.6993055555555556 | 155.509 |
| 0.7000000000000001 | 155.509 |
| 0.7006944444444444 | 155.509 |
| 0.7013888888888888 | 155.509 |
| 0.7020833333333334 | 150.964 |
| 0.7027777777777778 | 150.964 |
| 0.7034722222222222 | 146.423 |
| 0.7041666666666666 | 146.423 |
| 0.7048611111111112 | 146.423 |
| 0.7055555555555556 | 146.423 |
| 0.7062499999999999 | 146.423 |
| 0.7069444444444444 | 146.423 |
| 0.7076388888888889 | 146.423 |
| 0.7083333333333334 | 146.423 |
| 0.7090277777777777 | 146.423 |
| 0.7097222222222223 | 146.423 |
| 0.7104166666666667 | 146.423 |
| 0.7111111111111111 | 141.884 |
| 0.7118055555555555 | 146.423 |
| 0.7125 | 146.423 |
| 0.7131944444444445 | 141.884 |
| 0.7138888888888889 | 141.884 |
| 0.7145833333333332 | 141.884 |
| 0.7152777777777778 | 141.884 |
| 0.7159722222222222 | 141.884 |
| 0.7166666666666667 | 141.884 |
| 0.717361111111111 | 141.884 |
| 0.7180555555555556 | 137.347 |
| 0.71875 | 141.884 |
| 0.7194444444444444 | 137.347 |
| 0.720138888888889 | 137.347 |
| 0.7208333333333333 | 137.347 |
| 0.7215277777777778 | 137.347 |
| 0.7222222222222222 | 137.347 |
| 0.7229166666666668 | 137.347 |
| 0.7236111111111111 | 137.347 |
| 0.7243055555555555 | 137.347 |
| 0.725 | 137.347 |
| 0.7256944444444445 | 132.814 |
| 0.7263888888888889 | 132.814 |
| 0.7270833333333333 | 132.814 |
| 0.7277777777777777 | 132.814 |
| 0.7284722222222223 | 132.814 |
| 0.7291666666666666 | 132.814 |
| 0.7298611111111111 | 132.814 |
| 0.7305555555555556 | 132.814 |
| 0.7312500000000001 | 128.284 |
| 0.7319444444444444 | 132.814 |
| 0.7326388888888888 | 128.284 |
| 0.7333333333333334 | 128.284 |
| 0.7340277777777778 | 128.284 |
| 0.7347222222222222 | 128.284 |
| 0.7354166666666666 | 128.284 |
| 0.7361111111111112 | 128.284 |
| 0.7368055555555556 | 128.284 |
| 0.7374999999999999 | 128.284 |
| 0.7381944444444444 | 128.284 |
| 0.7388888888888889 | 123.758 |
| 0.7395833333333334 | 123.758 |
| 0.7402777777777777 | 123.758 |
| 0.7409722222222223 | 123.758 |
| 0.7416666666666667 | 123.758 |
| 0.7423611111111111 | 123.758 |
| 0.7430555555555555 | 119.235 |
| 0.74375 | 119.235 |
| 0.7444444444444445 | 119.235 |
| 0.7451388888888889 | 119.235 |
| 0.7458333333333332 | 119.235 |
| 0.7465277777777778 | 119.235 |
| 0.7472222222222222 | 114.716 |
| 0.7479166666666667 | 114.716 |
| 0.748611111111111 | 114.716 |
| 0.7493055555555556 | 114.716 |
| 0.75 | 110.201 |
| 0.7506944444444444 | 110.201 |
| 0.751388888888889 | 110.201 |
| 0.7520833333333333 | 110.201 |
| 0.7527777777777778 | 110.201 |
| 0.7534722222222222 | 110.201 |
| 0.7541666666666668 | 105.69 |
| 0.7548611111111111 | 105.69 |
| 0.7555555555555555 | 105.69 |
| 0.75625 | 105.69 |
| 0.7569444444444445 | 105.69 |
| 0.7576388888888889 | 101.184 |
| 0.7583333333333333 | 101.184 |
| 0.7590277777777777 | 101.184 |
| 0.7597222222222223 | 101.184 |
| 0.7604166666666666 | 101.184 |
| 0.7611111111111111 | 101.184 |
| 0.7618055555555556 | 101.184 |
| 0.7625000000000001 | 96.682 |
| 0.7631944444444444 | 96.682 |
| 0.7638888888888888 | 96.682 |
| 0.7645833333333334 | 96.682 |
| 0.7652777777777778 | 96.682 |
| 0.7659722222222222 | 92.184 |
| 0.7666666666666666 | 92.184 |
| 0.7673611111111112 | 92.184 |
| 0.7680555555555556 | 92.184 |
| 0.7687499999999999 | 92.184 |
| 0.7694444444444444 | 92.184 |
| 0.7701388888888889 | 87.692 |
| 0.7708333333333334 | 87.692 |
| 0.7715277777777777 | 87.692 |
| 0.7722222222222223 | 87.692 |
| 0.7729166666666667 | 87.692 |
| 0.7736111111111111 | 83.205 |
| 0.7743055555555555 | 83.205 |
| 0.775 | 83.205 |
| 0.7756944444444445 | 83.205 |
| 0.7763888888888889 | 83.205 |
| 0.7770833333333332 | 83.205 |
| 0.7777777777777778 | 83.205 |
| 0.7784722222222222 | 78.722 |
| 0.7791666666666667 | 78.722 |
| 0.779861111111111 | 78.722 |
| 0.7805555555555556 | 78.722 |
| 0.78125 | 78.722 |
| 0.7819444444444444 | 74.246 |
| 0.782638888888889 | 74.246 |
| 0.7833333333333333 | 74.246 |
| 0.7840277777777778 | 74.246 |
| 0.7847222222222222 | 74.246 |
| 0.7854166666666668 | 74.246 |
| 0.7861111111111111 | 69.775 |
| 0.7868055555555555 | 69.775 |
| 0.7875 | 69.775 |
| 0.7881944444444445 | 69.775 |
| 0.7888888888888889 | 69.775 |
| 0.7895833333333333 | 65.31 |
| 0.7902777777777777 | 65.31 |
| 0.7909722222222223 | 65.31 |
| 0.7916666666666666 | 65.31 |
| 0.7923611111111111 | 65.31 |
| 0.7930555555555556 | 65.31 |
| 0.7937500000000001 | 60.85 |
| 0.7944444444444444 | 60.85 |
| 0.7951388888888888 | 60.85 |
| 0.7958333333333334 | 60.85 |
| 0.7965277777777778 | 60.85 |
| 0.7972222222222222 | 56.398 |
| 0.7979166666666666 | 56.398 |
| 0.7986111111111112 | 56.398 |
| 0.7993055555555556 | 56.398 |
| 0.7999999999999999 | 56.398 |
| 0.8006944444444444 | 56.398 |
| 0.8013888888888889 | 56.398 |
| 0.8020833333333334 | 51.951 |
| 0.8027777777777777 | 51.951 |
| 0.8034722222222223 | 51.951 |
| 0.8041666666666667 | 51.951 |
| 0.8048611111111111 | 51.951 |
| 0.8055555555555555 | 47.511 |
| 0.80625 | 47.511 |
| 0.8069444444444445 | 47.511 |
| 0.8076388888888889 | 47.511 |
| 0.8083333333333332 | 47.511 |
| 0.8090277777777778 | 47.511 |
| 0.8097222222222222 | 47.511 |
| 0.8104166666666667 | 47.511 |
| 0.811111111111111 | 43.079 |
| 0.8118055555555556 | 43.079 |
| 0.8125 | 43.079 |
| 0.8131944444444444 | 43.079 |
| 0.813888888888889 | 38.653 |
| 0.8145833333333333 | 38.653 |
| 0.8152777777777778 | 38.653 |
| 0.8159722222222222 | 38.653 |
| 0.8166666666666668 | 38.653 |
| 0.8173611111111111 | 38.653 |
| 0.8180555555555555 | 38.653 |
| 0.81875 | 34.234 |
| 0.8194444444444445 | 34.234 |
| 0.8201388888888889 | 34.234 |
| 0.8208333333333333 | 34.234 |
| 0.8215277777777777 | 34.234 |
| 0.8222222222222223 | 29.823 |
| 0.8229166666666666 | 29.823 |
| 0.8236111111111111 | 29.823 |
| 0.8243055555555556 | 29.823 |
| 0.8250000000000001 | 29.823 |
| 0.8256944444444444 | 29.823 |
| 0.8263888888888888 | 25.419 |
| 0.8270833333333334 | 25.419 |
| 0.8277777777777778 | 25.419 |
| 0.8284722222222222 | 25.419 |
| 0.8291666666666666 | 21.024 |
| 0.8298611111111112 | 21.024 |
| 0.8305555555555556 | 21.024 |
| 0.8312499999999999 | 21.024 |
| 0.8319444444444444 | 21.024 |
| 0.8326388888888889 | 21.024 |
| 0.8333333333333334 | 16.636 |
| 0.8340277777777777 | 16.636 |
| 0.8347222222222223 | 16.636 |
| 0.8354166666666667 | 16.636 |
| 0.8361111111111111 | 12.257 |
| 0.8368055555555555 | 12.257 |
| 0.8375 | 12.257 |
| 0.8381944444444445 | 12.257 |
| 0.8388888888888889 | 12.257 |
| 0.8395833333333332 | 12.257 |
| 0.8402777777777778 | 7.887 |
| 0.8409722222222222 | 7.887 |
| 0.8416666666666667 | 7.887 |
| 0.842361111111111 | 7.887 |
| 0.8430555555555556 | 3.525 |
| 0.84375 | 3.525 |
| 0.8444444444444444 | 3.525 |
| 0.845138888888889 | 3.525 |
| 0.8458333333333333 | 3.525 |
| 0.8465277777777778 | 3.525 |
| 0.8472222222222222 | 3.525 |
| 0.8479166666666668 | 3.525 |
| 0.8486111111111111 | 0 |
| 0.8493055555555555 | 0 |
| 0.85 | 0 |
| 0.8506944444444445 | 0 |
| 0.8513888888888889 | 0 |
| 0.8520833333333333 | 0 |
| 0.8527777777777777 | 0 |
| 0.8534722222222223 | 0 |
| 0.8541666666666666 | 0 |
| 0.8548611111111111 | 0 |
| 0.8555555555555556 | 0 |
| 0.8562500000000001 | 0 |
| 0.8569444444444444 | 0 |
| 0.8576388888888888 | 0 |
| 0.8583333333333334 | 0 |
| 0.8590277777777778 | 0 |
| 0.8597222222222222 | 0 |
| 0.8604166666666666 | 0 |
| 0.8611111111111112 | 0 |
| 0.8618055555555556 | 0 |
| 0.8624999999999999 | 0 |
| 0.8631944444444444 | 0 |
| 0.8638888888888889 | 0 |
| 0.8645833333333334 | 0 |
| 0.8652777777777777 | 0 |
| 0.8659722222222223 | 0 |
| 0.8666666666666667 | 0 |
| 0.8673611111111111 | 0 |
| 0.8680555555555555 | 0 |
| 0.86875 | 0 |
| 0.8694444444444445 | 0 |
| 0.8701388888888889 | 0 |
| 0.8708333333333332 | 0 |
| 0.8715277777777778 | 0 |
| 0.8722222222222222 | 0 |
| 0.8729166666666667 | 0 |
| 0.873611111111111 | 0 |
| 0.8743055555555556 | 0 |
| 0.875 | 0 |
| 0.8756944444444444 | 0 |
| 0.876388888888889 | 0 |
| 0.8770833333333333 | 0 |
| 0.8777777777777778 | 0 |
| 0.8784722222222222 | 0 |
| 0.8791666666666668 | 0 |
| 0.8798611111111111 | 0 |
| 0.8805555555555555 | 0 |
| 0.88125 | 0 |
| 0.8819444444444445 | 0 |
| 0.8826388888888889 | 0 |
| 0.8833333333333333 | 0 |
| 0.8840277777777777 | 0 |
| 0.8847222222222223 | 0 |
| 0.8854166666666666 | 0 |
| 0.8861111111111111 | 0 |
| 0.8868055555555556 | 0 |
| 0.8875000000000001 | 0 |
| 0.8881944444444444 | 0 |
| 0.8888888888888888 | 0 |
| 0.8895833333333334 | 0 |
| 0.8902777777777778 | 0 |
| 0.8909722222222222 | 0 |
| 0.8916666666666666 | 0 |
| 0.8923611111111112 | 0 |
| 0.8930555555555556 | 0 |
| 0.8937499999999999 | 0 |
| 0.8944444444444444 | 0 |
| 0.8951388888888889 | 0 |
| 0.8958333333333334 | 0 |
| 0.8965277777777777 | 0 |
| 0.8972222222222223 | 0 |
| 0.8979166666666667 | 0 |
| 0.8986111111111111 | 0 |
| 0.8993055555555555 | 0 |
| 0.9 | 0 |
| 0.9006944444444445 | 0 |
| 0.9013888888888889 | 0 |
| 0.9020833333333332 | 0 |
| 0.9027777777777778 | 0 |
| 0.9034722222222222 | 0 |
| 0.9041666666666667 | 0 |
| 0.904861111111111 | 0 |
| 0.9055555555555556 | 0 |
| 0.90625 | 0 |
| 0.9069444444444444 | 0 |
| 0.907638888888889 | 0 |
| 0.9083333333333333 | 0 |
| 0.9090277777777778 | 0 |
| 0.9097222222222222 | 0 |
| 0.9104166666666668 | 0 |
| 0.9111111111111111 | 0 |
| 0.9118055555555555 | 0 |
| 0.9125 | 0 |
| 0.9131944444444445 | 0 |
| 0.9138888888888889 | 0 |
| 0.9145833333333333 | 0 |
| 0.9152777777777777 | 0 |
| 0.9159722222222223 | 0 |
| 0.9166666666666666 | 0 |
| 0.9173611111111111 | 0 |
| 0.9180555555555556 | 0 |
| 0.9187500000000001 | 0 |
| 0.9194444444444444 | 0 |
| 0.9201388888888888 | 0 |
| 0.9208333333333334 | 0 |
| 0.9215277777777778 | 0 |
| 0.9222222222222222 | 0 |
| 0.9229166666666666 | 0 |
| 0.9236111111111112 | 0 |
| 0.9243055555555556 | 0 |
| 0.9249999999999999 | 0 |
| 0.9256944444444444 | 0 |
| 0.9263888888888889 | 0 |
| 0.9270833333333334 | 0 |
| 0.9277777777777777 | 0 |
| 0.9284722222222223 | 0 |
| 0.9291666666666667 | 0 |
| 0.9298611111111111 | 0 |
| 0.9305555555555555 | 0 |
| 0.93125 | 0 |
| 0.9319444444444445 | 0 |
| 0.9326388888888889 | 0 |
| 0.9333333333333332 | 0 |
| 0.9340277777777778 | 0 |
| 0.9347222222222222 | 0 |
| 0.9354166666666667 | 0 |
| 0.936111111111111 | 0 |
| 0.9368055555555556 | 0 |
| 0.9375 | 0 |
| 0.9381944444444444 | 0 |
| 0.938888888888889 | 0 |
| 0.9395833333333333 | 0 |
| 0.9402777777777778 | 0 |
| 0.9409722222222222 | 0 |
| 0.9416666666666668 | 0 |
| 0.9423611111111111 | 0 |
| 0.9430555555555555 | 0 |
| 0.94375 | 0 |
| 0.9444444444444445 | 0 |
| 0.9451388888888889 | 0 |
| 0.9458333333333333 | 0 |
| 0.9465277777777777 | 0 |
| 0.9472222222222223 | 0 |
| 0.9479166666666666 | 0 |
| 0.9486111111111111 | 0 |
| 0.9493055555555556 | 0 |
| 0.9500000000000001 | 0 |
| 0.9506944444444444 | 0 |
| 0.9513888888888888 | 0 |
| 0.9520833333333334 | 0 |
| 0.9527777777777778 | 0 |
| 0.9534722222222222 | 0 |
| 0.9541666666666666 | 0 |
| 0.9548611111111112 | 0 |
| 0.9555555555555556 | 0 |
| 0.9562499999999999 | 0 |
| 0.9569444444444444 | 0 |
| 0.9576388888888889 | 0 |
| 0.9583333333333334 | 0 |
| 0.9590277777777777 | 0 |
| 0.9597222222222223 | 0 |
| 0.9604166666666667 | 0 |
| 0.9611111111111111 | 0 |
| 0.9618055555555555 | 0 |
| 0.9625 | 0 |
| 0.9631944444444445 | 0 |
| 0.9638888888888889 | 0 |
| 0.9645833333333332 | 0 |
| 0.9652777777777778 | 0 |
| 0.9659722222222222 | 0 |
| 0.9666666666666667 | 0 |
| 0.967361111111111 | 0 |
| 0.9680555555555556 | 0 |
| 0.96875 | 0 |
| 0.9694444444444444 | 0 |
| 0.970138888888889 | 0 |
| 0.9708333333333333 | 0 |
| 0.9715277777777778 | 0 |
| 0.9722222222222222 | 0 |
| 0.9729166666666668 | 0 |
| 0.9736111111111111 | 0 |
| 0.9743055555555555 | 0 |
| 0.975 | 0 |
| 0.9756944444444445 | 0 |
| 0.9763888888888889 | 0 |
| 0.9770833333333333 | 0 |
| 0.9777777777777777 | 0 |
| 0.9784722222222223 | 0 |
| 0.9791666666666666 | 0 |
| 0.9798611111111111 | 0 |
| 0.9805555555555556 | 0 |
| 0.9812500000000001 | 0 |
| 0.9819444444444444 | 0 |
| 0.9826388888888888 | 0 |
| 0.9833333333333334 | 0 |
| 0.9840277777777778 | 0 |
| 0.9847222222222222 | 0 |
| 0.9854166666666666 | 0 |
| 0.9861111111111112 | 0 |
| 0.9868055555555556 | 0 |
| 0.9874999999999999 | 0 |
| 0.9881944444444444 | 0 |
| 0.9888888888888889 | 0 |
| 0.9895833333333334 | 0 |
| 0.9902777777777777 | 0 |
| 0.9909722222222223 | 0 |
| 0.9916666666666667 | 0 |
| 0.9923611111111111 | 0 |
| 0.9930555555555555 | 0 |
| 0.99375 | 0 |
| 0.9944444444444445 | 0 |
| 0.9951388888888889 | 0 |
| 0.9958333333333332 | 0 |
| 0.9965277777777778 | 0 |
| 0.9972222222222222 | 0 |
| 0.9979166666666667 | 0 |
| 0.998611111111111 | 0 |
| 0.9993055555555556 | 0 |